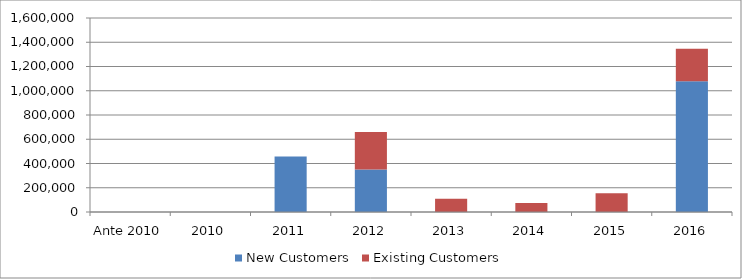
| Category | New Customers | Existing Customers |
|---|---|---|
| Ante 2010 | 0 | 0 |
| 2010 | 0 | 0 |
| 2011 | 458000 | 0 |
| 2012 | 350000 | 310000 |
| 2013 | 0 | 109037 |
| 2014 | 0 | 74230 |
| 2015 | 0 | 154427 |
| 2016 | 1077332.84 | 269097.52 |